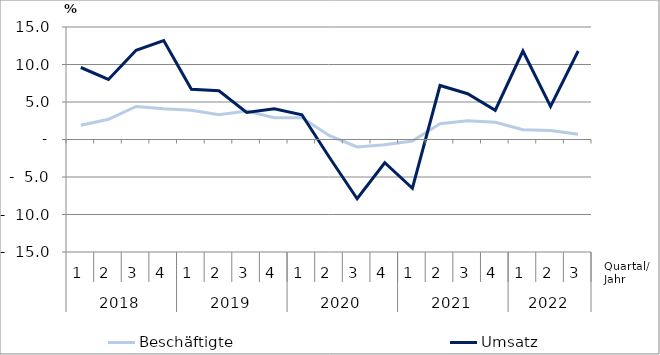
| Category | Beschäftigte | Umsatz |
|---|---|---|
| 0 | 1.9 | 9.6 |
| 1 | 2.7 | 8 |
| 2 | 4.4 | 11.9 |
| 3 | 4.1 | 13.2 |
| 4 | 3.9 | 6.7 |
| 5 | 3.3 | 6.5 |
| 6 | 3.8 | 3.6 |
| 7 | 2.9 | 4.1 |
| 8 | 2.9 | 3.3 |
| 9 | 0.5 | -2.4 |
| 10 | -1 | -7.9 |
| 11 | -0.7 | -3.1 |
| 12 | -0.2 | -6.5 |
| 13 | 2.1 | 7.2 |
| 14 | 2.5 | 6.1 |
| 15 | 2.3 | 3.9 |
| 16 | 1.3 | 11.8 |
| 17 | 1.2 | 4.4 |
| 18 | 0.7 | 11.8 |